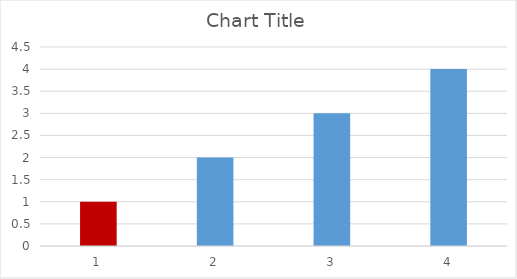
| Category | Series 0 |
|---|---|
| 0 | 1 |
| 1 | 2 |
| 2 | 3 |
| 3 | 4 |